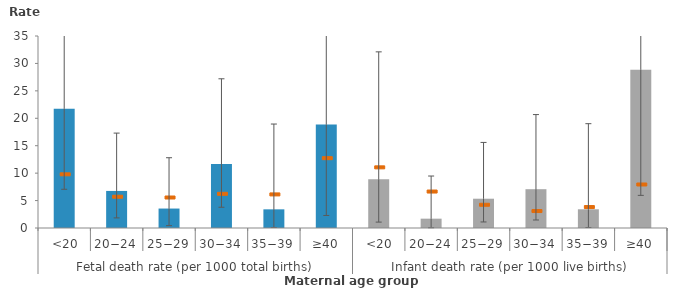
| Category | 1 |
|---|---|
| 0 | 21.739 |
| 1 | 6.757 |
| 2 | 3.546 |
| 3 | 11.655 |
| 4 | 3.401 |
| 5 | 18.868 |
| 6 | 8.889 |
| 7 | 1.701 |
| 8 | 5.338 |
| 9 | 7.075 |
| 10 | 3.413 |
| 11 | 28.846 |